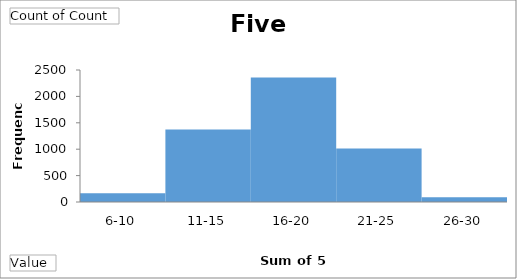
| Category | Total |
|---|---|
| 6-10 | 165 |
| 11-15 | 1374 |
| 16-20 | 2357 |
| 21-25 | 1014 |
| 26-30 | 90 |